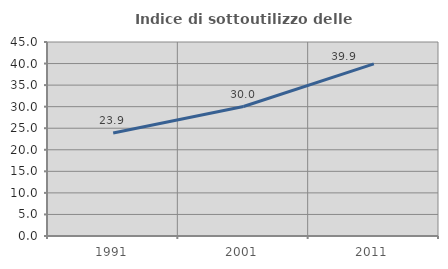
| Category | Indice di sottoutilizzo delle abitazioni  |
|---|---|
| 1991.0 | 23.894 |
| 2001.0 | 30.034 |
| 2011.0 | 39.936 |